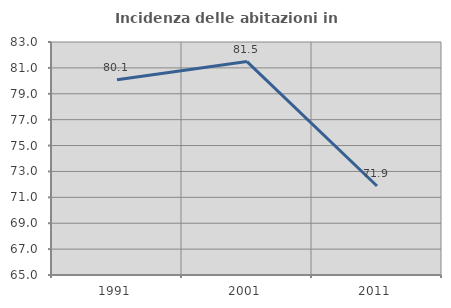
| Category | Incidenza delle abitazioni in proprietà  |
|---|---|
| 1991.0 | 80.085 |
| 2001.0 | 81.49 |
| 2011.0 | 71.875 |